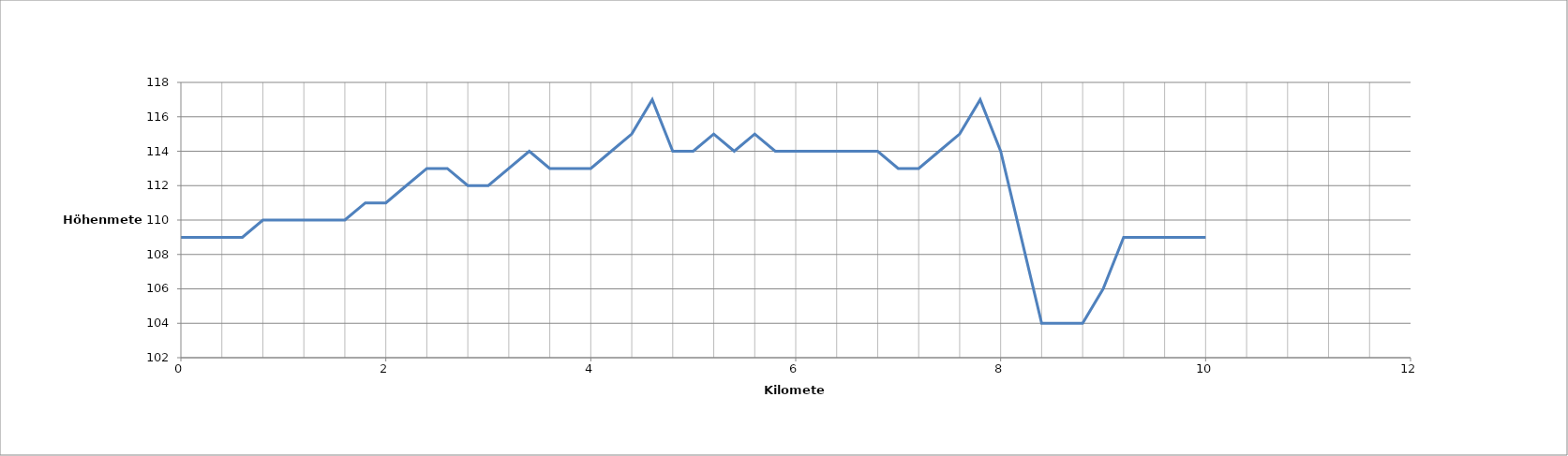
| Category | Series 0 |
|---|---|
| 0.0 | 109 |
| 0.2 | 109 |
| 0.4 | 109 |
| 0.6 | 109 |
| 0.8 | 110 |
| 1.0 | 110 |
| 1.2 | 110 |
| 1.4 | 110 |
| 1.6 | 110 |
| 1.8 | 111 |
| 2.0 | 111 |
| 2.2 | 112 |
| 2.4 | 113 |
| 2.6 | 113 |
| 2.8 | 112 |
| 3.0 | 112 |
| 3.2 | 113 |
| 3.4 | 114 |
| 3.6 | 113 |
| 3.8 | 113 |
| 4.0 | 113 |
| 4.2 | 114 |
| 4.4 | 115 |
| 4.6 | 117 |
| 4.8 | 114 |
| 5.0 | 114 |
| 5.2 | 115 |
| 5.4 | 114 |
| 5.6 | 115 |
| 5.8 | 114 |
| 6.0 | 114 |
| 6.2 | 114 |
| 6.4 | 114 |
| 6.6 | 114 |
| 6.8 | 114 |
| 7.0 | 113 |
| 7.2 | 113 |
| 7.4 | 114 |
| 7.6 | 115 |
| 7.8 | 117 |
| 8.0 | 114 |
| 8.2 | 109 |
| 8.4 | 104 |
| 8.6 | 104 |
| 8.8 | 104 |
| 9.0 | 106 |
| 9.2 | 109 |
| 9.4 | 109 |
| 9.6 | 109 |
| 9.8 | 109 |
| 10.0 | 109 |